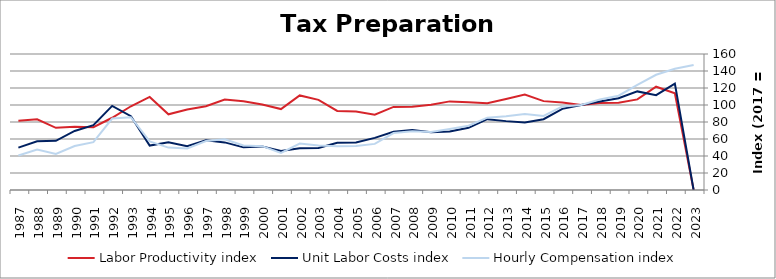
| Category | Labor Productivity index | Unit Labor Costs index | Hourly Compensation index |
|---|---|---|---|
| 2023.0 | 0 | 0 | 147.009 |
| 2022.0 | 113.826 | 125.236 | 142.551 |
| 2021.0 | 121.528 | 111.538 | 135.55 |
| 2020.0 | 106.573 | 116.006 | 123.631 |
| 2019.0 | 102.705 | 107.997 | 110.919 |
| 2018.0 | 102.309 | 104.067 | 106.47 |
| 2017.0 | 100 | 100 | 100 |
| 2016.0 | 102.98 | 95.466 | 98.31 |
| 2015.0 | 104.556 | 83.298 | 87.092 |
| 2014.0 | 112.279 | 79.514 | 89.278 |
| 2013.0 | 107.09 | 81.029 | 86.774 |
| 2012.0 | 102.104 | 83.341 | 85.094 |
| 2011.0 | 103.273 | 73.161 | 75.555 |
| 2010.0 | 104.251 | 68.736 | 71.658 |
| 2009.0 | 100.209 | 67.975 | 68.117 |
| 2008.0 | 97.895 | 70.689 | 69.202 |
| 2007.0 | 97.708 | 68.567 | 66.996 |
| 2006.0 | 88.478 | 61.326 | 54.26 |
| 2005.0 | 92.319 | 55.994 | 51.693 |
| 2004.0 | 93.015 | 55.474 | 51.599 |
| 2003.0 | 106.071 | 49.448 | 52.45 |
| 2002.0 | 111.273 | 49.16 | 54.702 |
| 2001.0 | 95.238 | 45.859 | 43.675 |
| 2000.0 | 100.595 | 51.303 | 51.608 |
| 1999.0 | 104.44 | 50.159 | 52.386 |
| 1998.0 | 106.506 | 56 | 59.644 |
| 1997.0 | 98.613 | 58.472 | 57.661 |
| 1996.0 | 94.802 | 51.461 | 48.786 |
| 1995.0 | 89.014 | 56.046 | 49.889 |
| 1994.0 | 109.488 | 52.265 | 57.225 |
| 1993.0 | 98.506 | 86.906 | 85.608 |
| 1992.0 | 84.984 | 98.944 | 84.086 |
| 1991.0 | 73.877 | 76.255 | 56.335 |
| 1990.0 | 74.417 | 69.495 | 51.716 |
| 1989.0 | 73.191 | 57.907 | 42.383 |
| 1988.0 | 83.095 | 57.39 | 47.688 |
| 1987.0 | 81.46 | 49.888 | 40.639 |